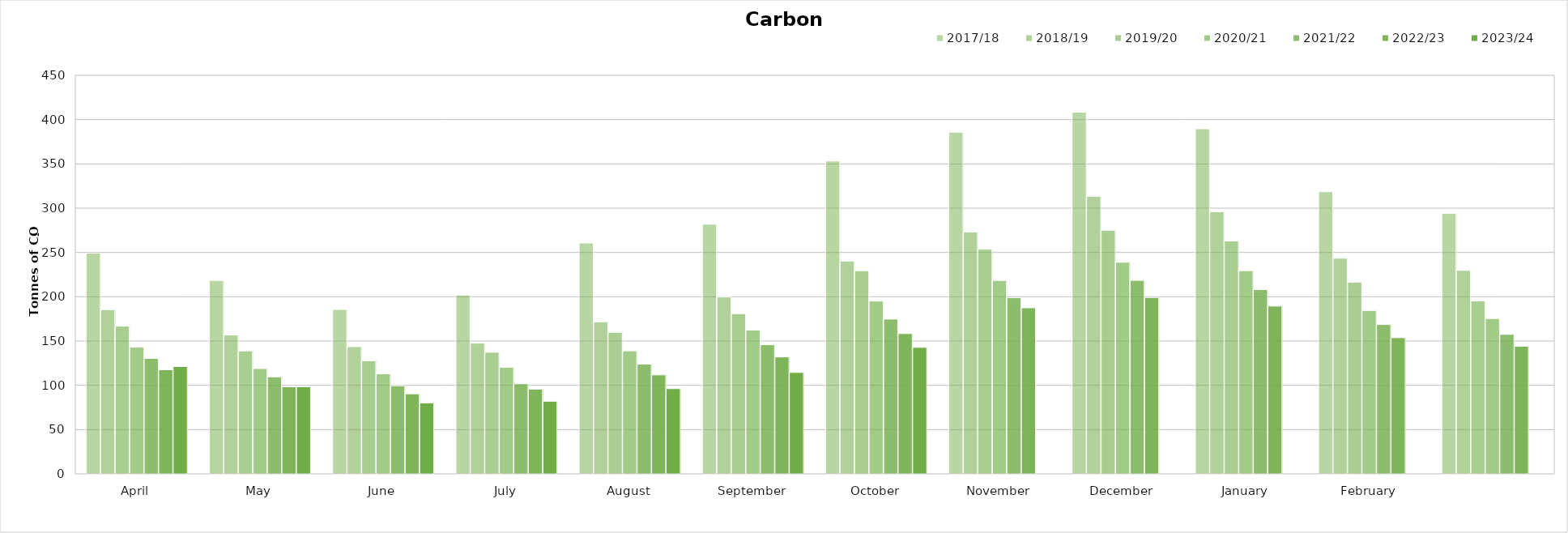
| Category | 2017/18 | 2018/19 | 2019/20 | 2020/21 | 2021/22 | 2022/23 | 2023/24 |
|---|---|---|---|---|---|---|---|
| April | 249.211 | 185.428 | 166.791 | 143.077 | 130.317 | 117.585 | 121.262 |
| May | 218.364 | 156.873 | 138.899 | 118.928 | 109.587 | 98.377 | 98.444 |
| June | 185.588 | 143.709 | 127.655 | 112.971 | 99.46 | 90.415 | 80.136 |
| July | 201.923 | 147.632 | 137.339 | 120.425 | 101.746 | 95.694 | 82.013 |
| August | 260.683 | 171.747 | 159.569 | 138.913 | 123.993 | 111.733 | 96.275 |
| September | 281.87 | 199.68 | 180.836 | 162.28 | 145.774 | 132.047 | 114.523 |
| October | 353.18 | 240.276 | 229.396 | 195.138 | 174.797 | 158.411 | 142.823 |
| November | 385.798 | 273.01 | 253.652 | 218.424 | 198.88 | 187.541 | 0 |
| December | 408.442 | 313.296 | 275.101 | 238.941 | 218.487 | 199.17 | 0 |
| January | 389.646 | 296.021 | 262.938 | 229.422 | 208.06 | 189.482 | 0 |
| February | 318.635 | 243.459 | 216.451 | 184.471 | 168.674 | 153.819 | 0 |